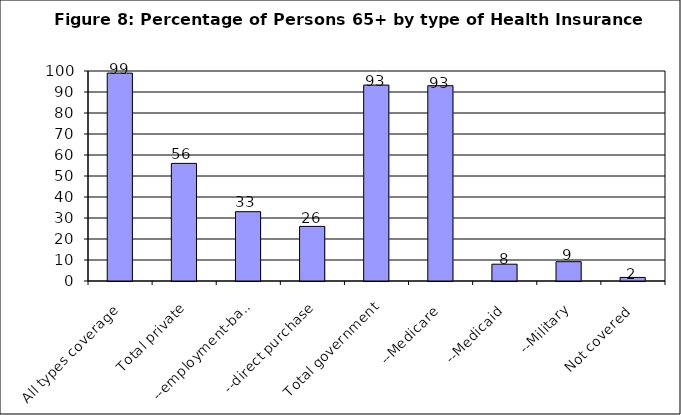
| Category | Series 0 |
|---|---|
| All types coverage | 99 |
| Total private | 56 |
| --employment-based | 33 |
| --direct purchase | 26 |
| Total government | 93.3 |
| --Medicare | 93 |
| --Medicaid | 8 |
| --Military | 9.2 |
| Not covered | 1.7 |